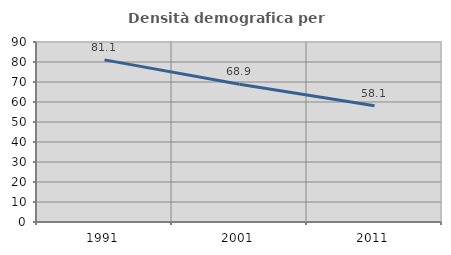
| Category | Densità demografica |
|---|---|
| 1991.0 | 81.073 |
| 2001.0 | 68.902 |
| 2011.0 | 58.124 |